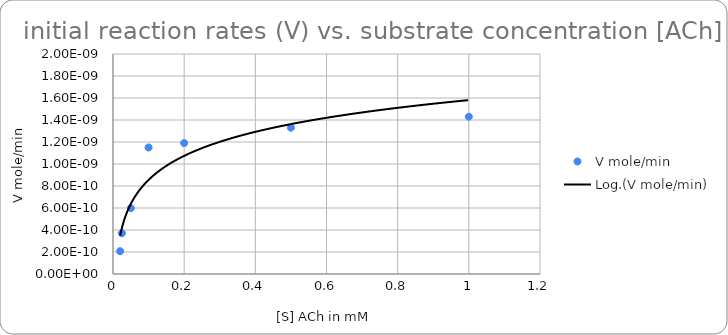
| Category | V mole/min |
|---|---|
| 0.02 | 0 |
| 0.025 | 0 |
| 0.05 | 0 |
| 0.1 | 0 |
| 0.2 | 0 |
| 0.5 | 0 |
| 1.0 | 0 |